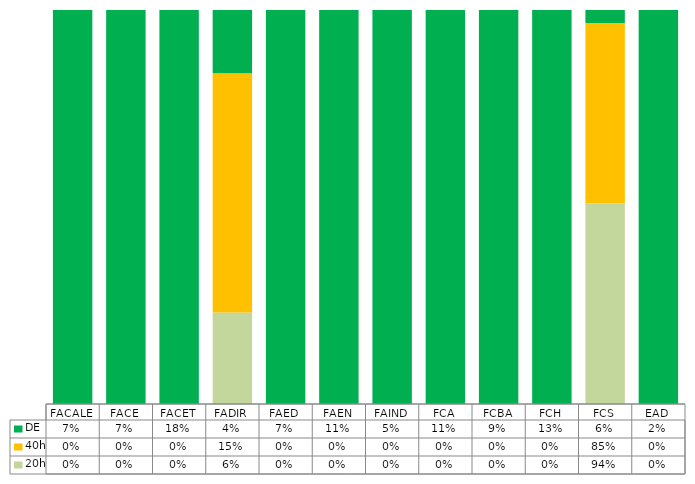
| Category | 20h | 40h | DE |
|---|---|---|---|
| FACALE | 0 | 0 | 0.068 |
| FACE | 0 | 0 | 0.074 |
| FACET | 0 | 0 | 0.181 |
| FADIR | 0.059 | 0.154 | 0.041 |
| FAED | 0 | 0 | 0.07 |
| FAEN | 0 | 0 | 0.105 |
| FAIND | 0 | 0 | 0.046 |
| FCA | 0 | 0 | 0.113 |
| FCBA | 0 | 0 | 0.089 |
| FCH | 0 | 0 | 0.135 |
| FCS | 0.941 | 0.846 | 0.061 |
| EAD | 0 | 0 | 0.018 |